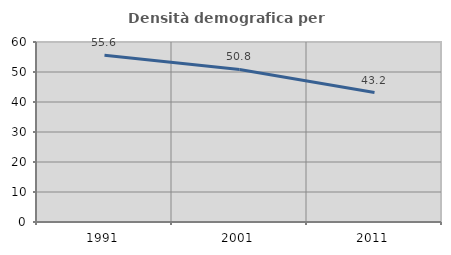
| Category | Densità demografica |
|---|---|
| 1991.0 | 55.562 |
| 2001.0 | 50.848 |
| 2011.0 | 43.162 |